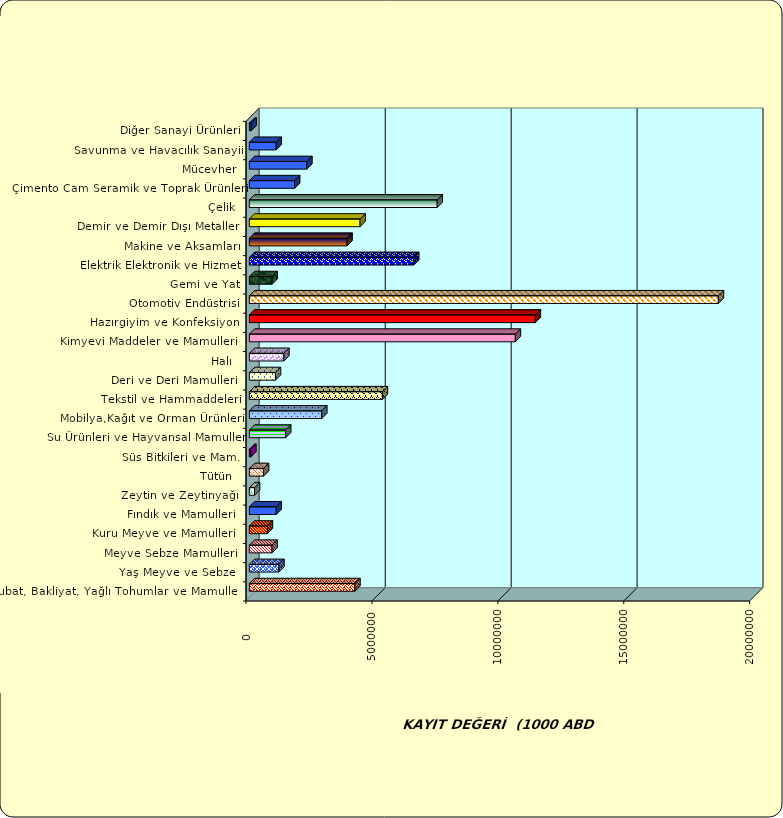
| Category | Series 0 |
|---|---|
|  Hububat, Bakliyat, Yağlı Tohumlar ve Mamulleri  | 4192885.342 |
|  Yaş Meyve ve Sebze   | 1176322.437 |
|  Meyve Sebze Mamulleri  | 899829.094 |
|  Kuru Meyve ve Mamulleri   | 717167.421 |
|  Fındık ve Mamulleri  | 1068728.96 |
|  Zeytin ve Zeytinyağı  | 206855.877 |
|  Tütün  | 564897.988 |
|  Süs Bitkileri ve Mam. | 59189.625 |
|  Su Ürünleri ve Hayvansal Mamuller | 1442955.947 |
|  Mobilya,Kağıt ve Orman Ürünleri | 2876392.564 |
|  Tekstil ve Hammaddeleri | 5283193.882 |
|  Deri ve Deri Mamulleri  | 1037117.386 |
|  Halı  | 1372710.012 |
|  Kimyevi Maddeler ve Mamulleri   | 10561831.334 |
|  Hazırgiyim ve Konfeksiyon  | 11356827.431 |
|  Otomotiv Endüstrisi | 18624393.812 |
|  Gemi ve Yat | 903960.789 |
|  Elektrik Elektronik ve Hizmet | 6527389.246 |
|  Makine ve Aksamları | 3879420.933 |
|  Demir ve Demir Dışı Metaller  | 4396618.04 |
|  Çelik | 7461652.986 |
|  Çimento Cam Seramik ve Toprak Ürünleri | 1798181.641 |
|  Mücevher | 2284453.641 |
|  Savunma ve Havacılık Sanayii | 1066633.532 |
|  Diğer Sanayi Ürünleri | 71532.997 |